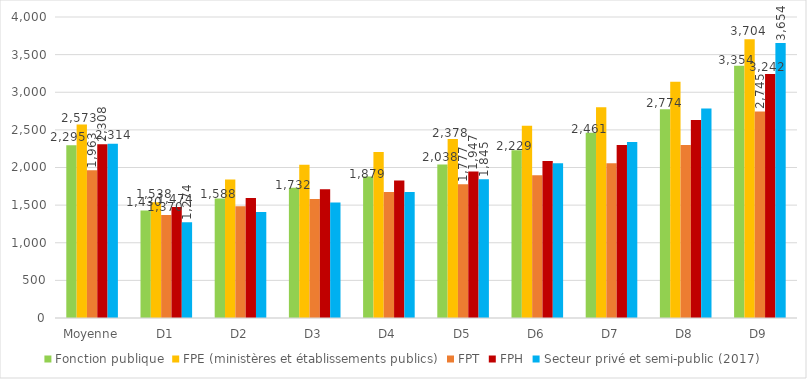
| Category | Fonction publique | FPE (ministères et établissements publics) | FPT | FPH | Secteur privé et semi-public (2017) |
|---|---|---|---|---|---|
| Moyenne | 2295.15 | 2572.71 | 1962.78 | 2307.8 | 2314 |
| D1 | 1429.67 | 1538.32 | 1369.6 | 1473.58 | 1274 |
| D2 | 1588.32 | 1842.19 | 1486.31 | 1594.25 | 1408 |
| D3 | 1732.42 | 2035.42 | 1582.08 | 1709.69 | 1534 |
| D4 | 1879.25 | 2207.25 | 1675.33 | 1826.42 | 1676 |
| D5 | 2038.25 | 2378.08 | 1776.67 | 1946.5 | 1845 |
| D6 | 2228.75 | 2555.92 | 1898.42 | 2086.77 | 2056 |
| D7 | 2460.78 | 2800.17 | 2055.5 | 2299.48 | 2340 |
| D8 | 2773.95 | 3138.42 | 2297.58 | 2630.36 | 2784 |
| D9 | 3353.5 | 3704.42 | 2744.92 | 3242.25 | 3654 |